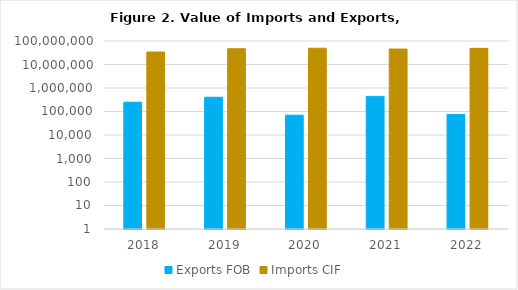
| Category | Exports FOB | Imports CIF  |
|---|---|---|
| 2018.0 | 248364.56 | 34017895.202 |
| 2019.0 | 404589.12 | 46851620.9 |
| 2020.0 | 69481.68 | 49162814.97 |
| 2021.0 | 439871.6 | 45478827.42 |
| 2022.0 | 75155.36 | 48599426.717 |